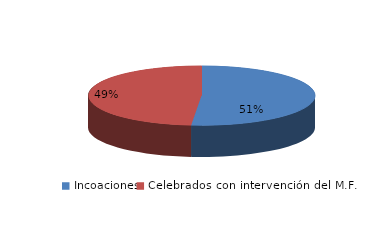
| Category | Series 0 |
|---|---|
| Incoaciones | 393 |
| Celebrados con intervención del M.F. | 371 |